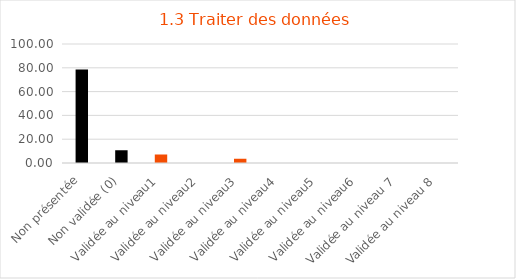
| Category | Series 0 |
|---|---|
| Non présentée | 78.571 |
| Non validée (0) | 10.714 |
| Validée au niveau1 | 7.143 |
| Validée au niveau2 | 0 |
| Validée au niveau3 | 3.571 |
| Validée au niveau4 | 0 |
| Validée au niveau5 | 0 |
| Validée au niveau6 | 0 |
| Validée au niveau 7 | 0 |
| Validée au niveau 8 | 0 |